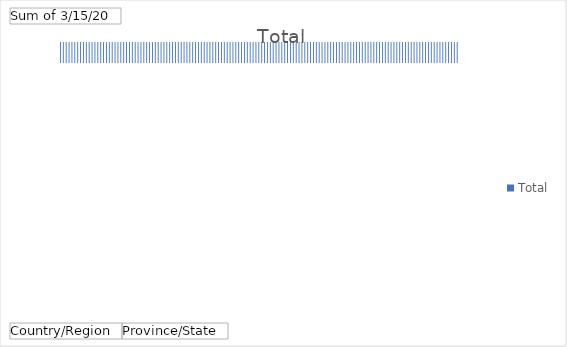
| Category | Total |
|---|---|
| 0 | 81003 |
| 1 | 24747 |
| 2 | 13938 |
| 3 | 8162 |
| 4 | 7798 |
| 5 | 5795 |
| 6 | 4523 |
| 7 | 3499 |
| 8 | 2200 |
| 9 | 1221 |
| 10 | 1145 |
| 11 | 1138 |
| 12 | 1022 |
| 13 | 886 |
| 14 | 875 |
| 15 | 860 |
| 16 | 839 |
| 17 | 696 |
| 18 | 428 |
| 19 | 401 |
| 20 | 331 |
| 21 | 297 |
| 22 | 253 |
| 23 | 252 |
| 24 | 251 |
| 25 | 245 |
| 26 | 244 |
| 27 | 226 |
| 28 | 219 |
| 29 | 214 |
| 30 | 171 |
| 31 | 171 |
| 32 | 162 |
| 33 | 140 |
| 34 | 131 |
| 35 | 129 |
| 36 | 119 |
| 37 | 117 |
| 38 | 116 |
| 39 | 114 |
| 40 | 113 |
| 41 | 112 |
| 42 | 110 |
| 43 | 110 |
| 44 | 103 |
| 45 | 101 |
| 46 | 98 |
| 47 | 74 |
| 48 | 63 |
| 49 | 59 |
| 50 | 59 |
| 51 | 56 |
| 52 | 54 |
| 53 | 53 |
| 54 | 51 |
| 55 | 51 |
| 56 | 50 |
| 57 | 49 |
| 58 | 48 |
| 59 | 48 |
| 60 | 45 |
| 61 | 43 |
| 62 | 43 |
| 63 | 42 |
| 64 | 41 |
| 65 | 34 |
| 66 | 33 |
| 67 | 32 |
| 68 | 30 |
| 69 | 28 |
| 70 | 28 |
| 71 | 27 |
| 72 | 27 |
| 73 | 26 |
| 74 | 26 |
| 75 | 24 |
| 76 | 24 |
| 77 | 23 |
| 78 | 23 |
| 79 | 22 |
| 80 | 21 |
| 81 | 18 |
| 82 | 18 |
| 83 | 16 |
| 84 | 14 |
| 85 | 13 |
| 86 | 12 |
| 87 | 11 |
| 88 | 10 |
| 89 | 10 |
| 90 | 10 |
| 91 | 9 |
| 92 | 9 |
| 93 | 8 |
| 94 | 8 |
| 95 | 7 |
| 96 | 6 |
| 97 | 6 |
| 98 | 6 |
| 99 | 5 |
| 100 | 4 |
| 101 | 4 |
| 102 | 4 |
| 103 | 4 |
| 104 | 3 |
| 105 | 3 |
| 106 | 3 |
| 107 | 3 |
| 108 | 2 |
| 109 | 2 |
| 110 | 2 |
| 111 | 2 |
| 112 | 2 |
| 113 | 2 |
| 114 | 2 |
| 115 | 2 |
| 116 | 2 |
| 117 | 1 |
| 118 | 1 |
| 119 | 1 |
| 120 | 1 |
| 121 | 1 |
| 122 | 1 |
| 123 | 1 |
| 124 | 1 |
| 125 | 1 |
| 126 | 1 |
| 127 | 1 |
| 128 | 1 |
| 129 | 1 |
| 130 | 1 |
| 131 | 1 |
| 132 | 1 |
| 133 | 1 |
| 134 | 1 |
| 135 | 1 |
| 136 | 1 |
| 137 | 1 |
| 138 | 1 |
| 139 | 0 |
| 140 | 0 |
| 141 | 0 |
| 142 | 0 |
| 143 | 0 |
| 144 | 0 |
| 145 | 0 |
| 146 | 0 |
| 147 | 0 |
| 148 | 0 |
| 149 | 0 |
| 150 | 0 |
| 151 | 0 |